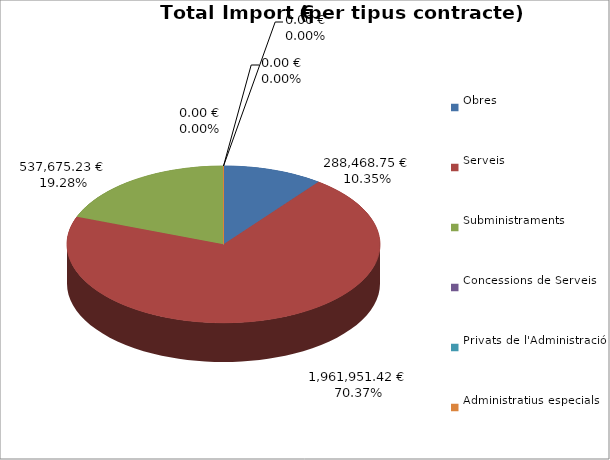
| Category | Total preu
(amb IVA) |
|---|---|
| Obres | 288468.75 |
| Serveis | 1961951.42 |
| Subministraments | 537675.23 |
| Concessions de Serveis | 0 |
| Privats de l'Administració | 0 |
| Administratius especials | 0 |